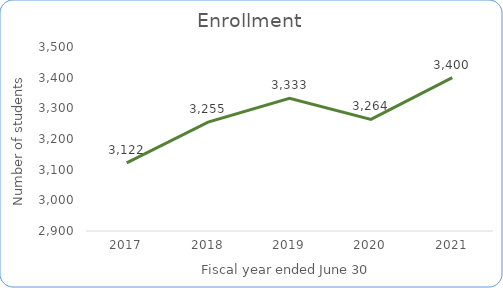
| Category | Enrollment |
|---|---|
| 2017-06-30 | 3122 |
| 2018-06-30 | 3255 |
| 2019-06-30 | 3333 |
| 2020-06-30 | 3264 |
| 2021-06-30 | 3400 |